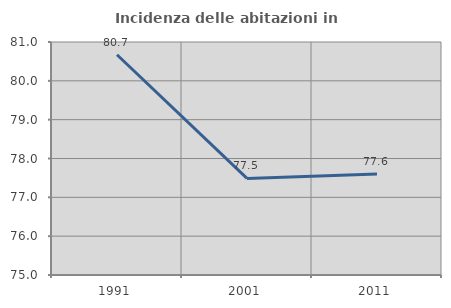
| Category | Incidenza delle abitazioni in proprietà  |
|---|---|
| 1991.0 | 80.671 |
| 2001.0 | 77.488 |
| 2011.0 | 77.598 |